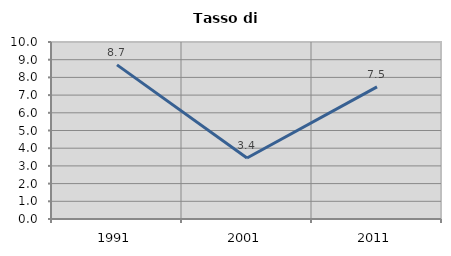
| Category | Tasso di disoccupazione   |
|---|---|
| 1991.0 | 8.706 |
| 2001.0 | 3.448 |
| 2011.0 | 7.468 |